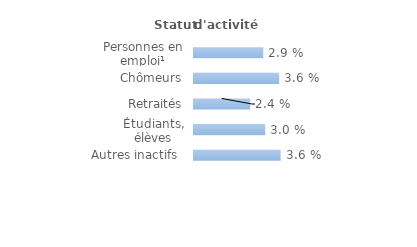
| Category | Series 0 |
|---|---|
| Personnes en emploi¹ | 0.029 |
| Chômeurs | 0.036 |
| Retraités | 0.024 |
| Étudiants, élèves | 0.03 |
| Autres inactifs  | 0.036 |